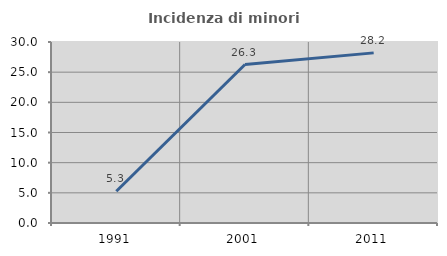
| Category | Incidenza di minori stranieri |
|---|---|
| 1991.0 | 5.263 |
| 2001.0 | 26.263 |
| 2011.0 | 28.197 |